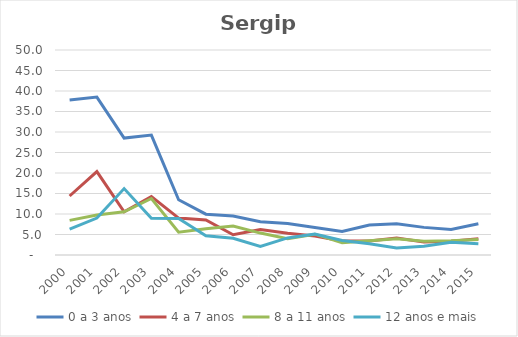
| Category | 0 a 3 anos | 4 a 7 anos | 8 a 11 anos | 12 anos e mais |
|---|---|---|---|---|
| 2000.0 | 37.779 | 14.391 | 8.451 | 6.316 |
| 2001.0 | 38.509 | 20.344 | 9.74 | 9.016 |
| 2002.0 | 28.513 | 10.557 | 10.526 | 16.197 |
| 2003.0 | 29.255 | 14.255 | 13.776 | 8.955 |
| 2004.0 | 13.467 | 9.003 | 5.576 | 8.904 |
| 2005.0 | 9.963 | 8.534 | 6.4 | 4.701 |
| 2006.0 | 9.485 | 4.93 | 7.045 | 4.065 |
| 2007.0 | 8.129 | 6.215 | 5.344 | 2.098 |
| 2008.0 | 7.699 | 5.283 | 3.971 | 4.167 |
| 2009.0 | 6.707 | 4.636 | 5.08 | 5.108 |
| 2010.0 | 5.727 | 3.44 | 2.998 | 3.532 |
| 2011.0 | 7.296 | 3.43 | 3.463 | 2.759 |
| 2012.0 | 7.637 | 4.123 | 3.972 | 1.705 |
| 2013.0 | 6.738 | 3.157 | 3.366 | 2.122 |
| 2014.0 | 6.209 | 3.382 | 3.482 | 3.085 |
| 2015.0 | 7.602 | 3.963 | 3.766 | 2.736 |